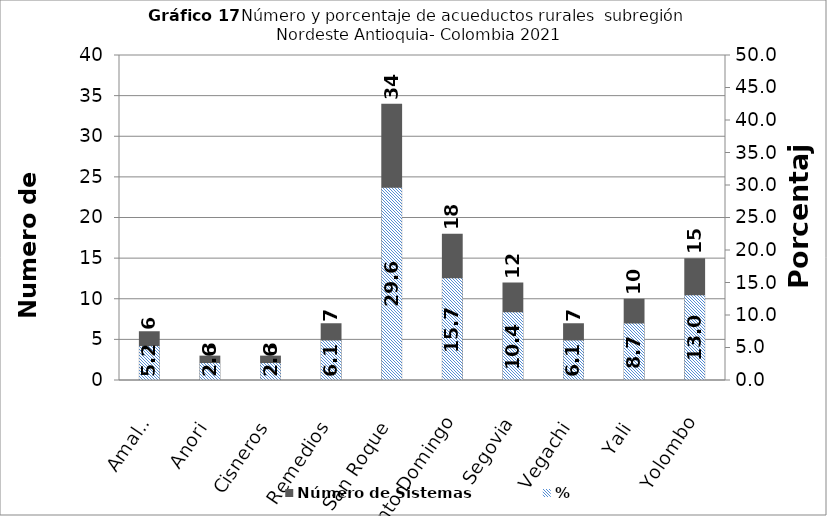
| Category | Número de Sistemas |
|---|---|
| Amalfi | 6 |
| Anori | 3 |
| Cisneros | 3 |
| Remedios | 7 |
| San Roque | 34 |
| Santo Domingo | 18 |
| Segovia | 12 |
| Vegachi | 7 |
| Yali | 10 |
| Yolombo | 15 |